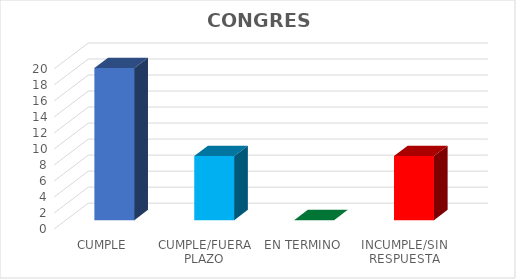
| Category | TOTAL |
|---|---|
| CUMPLE | 19 |
| CUMPLE/FUERA PLAZO | 8 |
| EN TERMINO | 0 |
| INCUMPLE/SIN RESPUESTA | 8 |